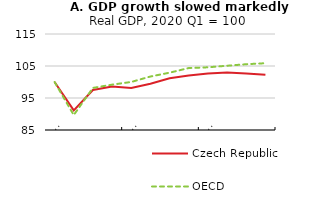
| Category | Czech Republic | OECD |
|---|---|---|
| 2020-02-15 | 100 | 100 |
| 2020-05-15 | 91.151 | 89.677 |
| 2020-08-15 | 97.489 | 98.149 |
| 2020-11-15 | 98.601 | 99.173 |
| 2021-02-15 | 98.113 | 100.014 |
| 2021-05-15 | 99.476 | 101.715 |
| 2021-08-15 | 101.165 | 102.908 |
| 2021-11-15 | 102.025 | 104.363 |
| 2022-02-15 | 102.686 | 104.592 |
| 2022-05-15 | 102.968 | 105.083 |
| 2022-08-15 | 102.641 | 105.559 |
| 2022-11-15 | 102.268 | 105.871 |